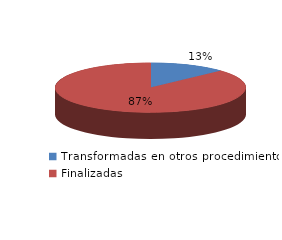
| Category | Series 0 |
|---|---|
| Transformadas en otros procedimientos | 728 |
| Finalizadas | 4862 |